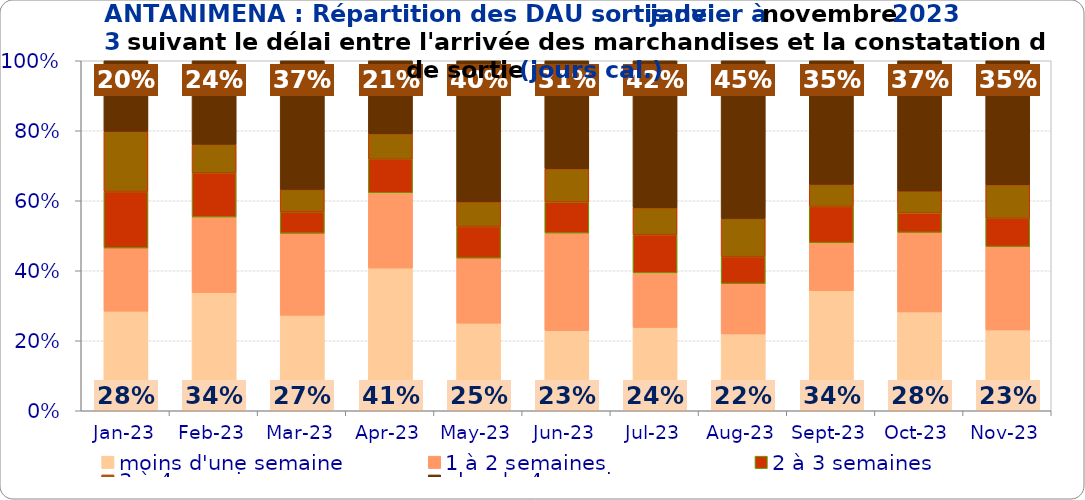
| Category | moins d'une semaine | 1 à 2 semaines | 2 à 3 semaines | 3 à 4 semaines | plus de 4 semaines |
|---|---|---|---|---|---|
| 2023-01-01 | 0.285 | 0.181 | 0.161 | 0.172 | 0.201 |
| 2023-02-01 | 0.338 | 0.216 | 0.126 | 0.082 | 0.238 |
| 2023-03-01 | 0.273 | 0.235 | 0.061 | 0.064 | 0.368 |
| 2023-04-01 | 0.408 | 0.215 | 0.096 | 0.073 | 0.208 |
| 2023-05-01 | 0.25 | 0.186 | 0.09 | 0.071 | 0.403 |
| 2023-06-01 | 0.229 | 0.279 | 0.088 | 0.095 | 0.308 |
| 2023-07-01 | 0.238 | 0.156 | 0.109 | 0.077 | 0.42 |
| 2023-08-01 | 0.22 | 0.144 | 0.077 | 0.109 | 0.451 |
| 2023-09-01 | 0.343 | 0.137 | 0.104 | 0.063 | 0.353 |
| 2023-10-01 | 0.282 | 0.227 | 0.056 | 0.063 | 0.372 |
| 2023-11-01 | 0.231 | 0.238 | 0.08 | 0.096 | 0.354 |